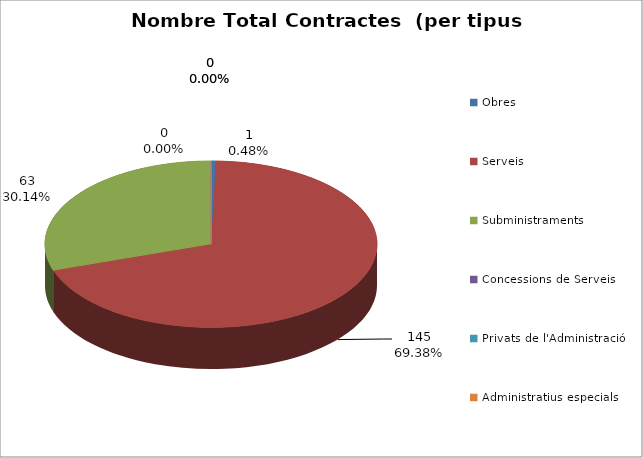
| Category | Nombre Total Contractes |
|---|---|
| Obres | 1 |
| Serveis | 145 |
| Subministraments | 63 |
| Concessions de Serveis | 0 |
| Privats de l'Administració | 0 |
| Administratius especials | 0 |